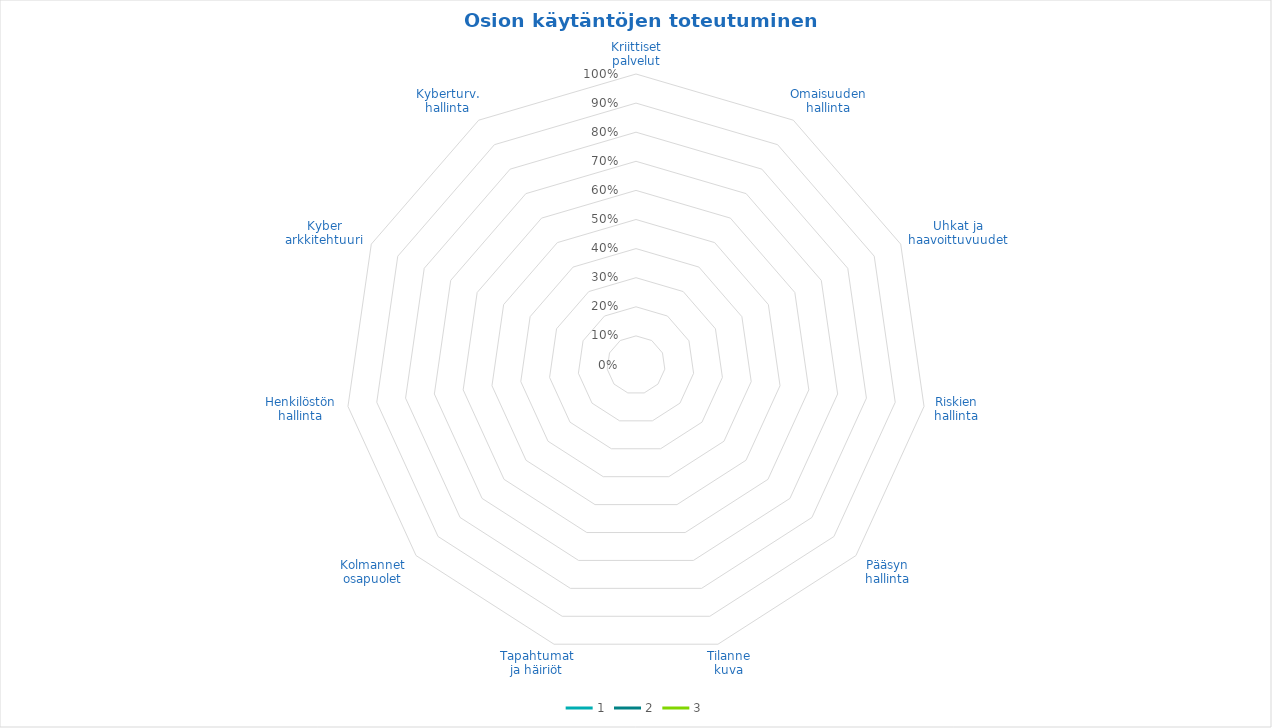
| Category | 1 | 2 | 3 |
|---|---|---|---|
| 0 | 0 | 0 | 0 |
| 1 | 0 | 0 | 0 |
| 2 | 0 | 0 | 0 |
| 3 | 0 | 0 | 0 |
| 4 | 0 | 0 | 0 |
| 5 | 0 | 0 | 0 |
| 6 | 0 | 0 | 0 |
| 7 | 0 | 0 | 0 |
| 8 | 0 | 0 | 0 |
| 9 | 0 | 0 | 0 |
| 10 | 0 | 0 | 0 |